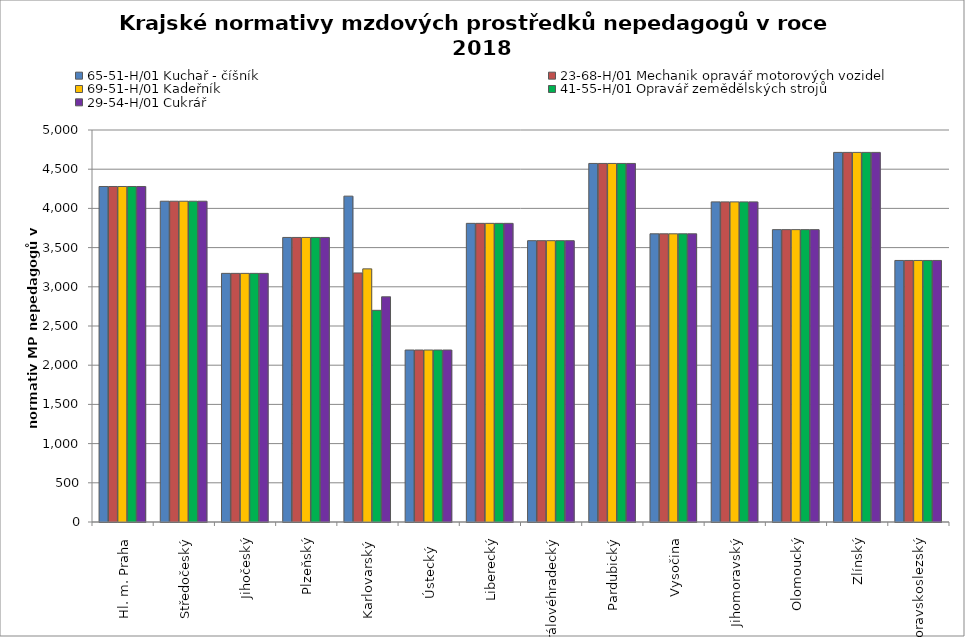
| Category | 65-51-H/01 Kuchař - číšník | 23-68-H/01 Mechanik opravář motorových vozidel | 69-51-H/01 Kadeřník | 41-55-H/01 Opravář zemědělských strojů | 29-54-H/01 Cukrář |
|---|---|---|---|---|---|
| Hl. m. Praha | 4279.355 | 4279.355 | 4279.355 | 4279.355 | 4279.355 |
| Středočeský | 4091.438 | 4091.438 | 4091.438 | 4091.438 | 4091.438 |
| Jihočeský | 3171.327 | 3171.327 | 3171.327 | 3171.327 | 3171.327 |
| Plzeňský | 3629.455 | 3629.455 | 3629.455 | 3629.455 | 3629.455 |
| Karlovarský  | 4156.244 | 3176.471 | 3228.7 | 2700 | 2872.34 |
| Ústecký   | 2193.526 | 2193.526 | 2193.526 | 2193.526 | 2193.526 |
| Liberecký | 3809.239 | 3809.239 | 3809.239 | 3809.239 | 3809.239 |
| Královéhradecký | 3588.25 | 3588.25 | 3588.25 | 3588.25 | 3588.25 |
| Pardubický | 4573.309 | 4573.309 | 4573.309 | 4573.309 | 4573.309 |
| Vysočina | 3675.889 | 3675.889 | 3675.889 | 3675.889 | 3675.889 |
| Jihomoravský | 4083.182 | 4083.182 | 4083.182 | 4083.182 | 4083.182 |
| Olomoucký | 3729.225 | 3729.225 | 3729.225 | 3729.225 | 3729.225 |
| Zlínský | 4714.286 | 4714.286 | 4714.286 | 4714.286 | 4714.286 |
| Moravskoslezský | 3335.966 | 3335.966 | 3335.966 | 3335.966 | 3335.966 |